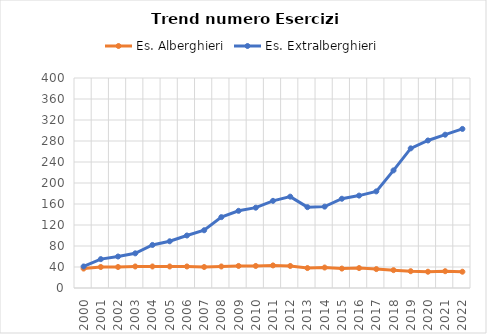
| Category | Es. Alberghieri | Es. Extralberghieri |
|---|---|---|
| 2000.0 | 37 | 41 |
| 2001.0 | 40 | 55 |
| 2002.0 | 40 | 60 |
| 2003.0 | 41 | 66 |
| 2004.0 | 41 | 82 |
| 2005.0 | 41 | 89 |
| 2006.0 | 41 | 100 |
| 2007.0 | 40 | 110 |
| 2008.0 | 41 | 135 |
| 2009.0 | 42 | 147 |
| 2010.0 | 42 | 153 |
| 2011.0 | 43 | 166 |
| 2012.0 | 42 | 174 |
| 2013.0 | 38 | 154 |
| 2014.0 | 39 | 155 |
| 2015.0 | 37 | 170 |
| 2016.0 | 38 | 176 |
| 2017.0 | 36 | 184 |
| 2018.0 | 34 | 224 |
| 2019.0 | 32 | 266 |
| 2020.0 | 31 | 281 |
| 2021.0 | 32 | 292 |
| 2022.0 | 31 | 303 |